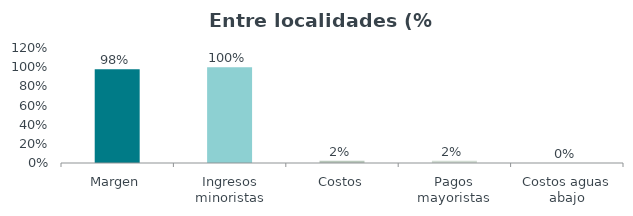
| Category | Series 0 |
|---|---|
| Margen | 0.977 |
| Ingresos minoristas | 1 |
| Costos | 0.023 |
| Pagos mayoristas | 0.023 |
| Costos aguas abajo | 0 |